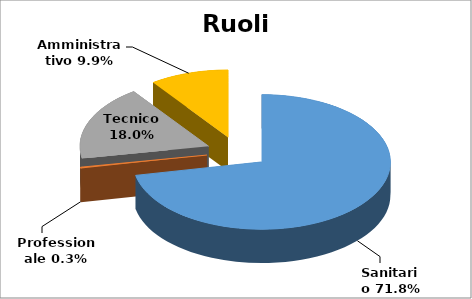
| Category | Series 0 |
|---|---|
| Sanitario | 0.718 |
| Professionale | 0.003 |
| Tecnico | 0.18 |
| Amministrativo | 0.099 |